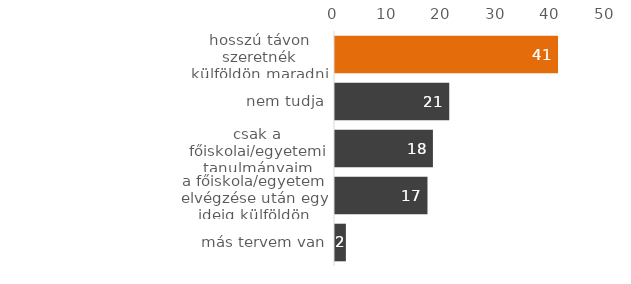
| Category | százalék |
|---|---|
| más tervem van | 2 |
| a főiskola/egyetem elvégzése után egy ideig külföldön szeretnék dolgozni | 17 |
| csak a főiskolai/egyetemi tanulmányaim idejére | 18 |
| nem tudja | 21 |
| hosszú távon szeretnék külföldön maradni | 41 |